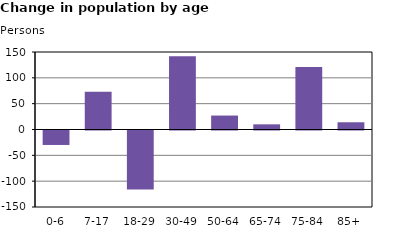
| Category | Series 2 |
|---|---|
| 0-6 | -28 |
| 7-17 | 73 |
| 18-29 | -114 |
| 30-49 | 142 |
| 50-64 | 27 |
| 65-74 | 10 |
| 75-84 | 121 |
| 85+ | 14 |